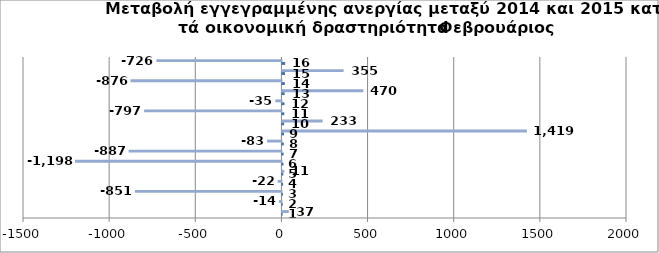
| Category | Series 0 | Series 1 |
|---|---|---|
| 0 | 1 | 37 |
| 1 | 2 | -14 |
| 2 | 3 | -851 |
| 3 | 4 | -22 |
| 4 | 5 | 11 |
| 5 | 6 | -1198 |
| 6 | 7 | -887 |
| 7 | 8 | -83 |
| 8 | 9 | 1419 |
| 9 | 10 | 233 |
| 10 | 11 | -797 |
| 11 | 12 | -35 |
| 12 | 13 | 470 |
| 13 | 14 | -876 |
| 14 | 15 | 355 |
| 15 | 16 | -726 |